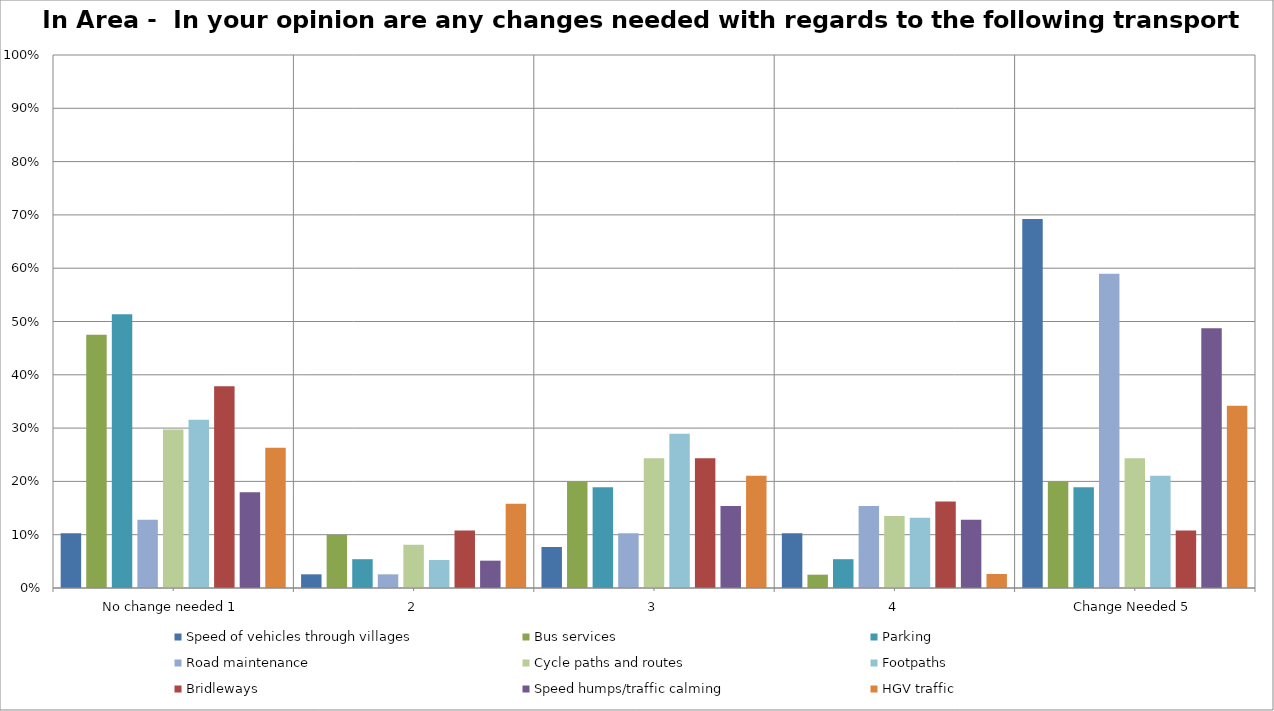
| Category | Speed of vehicles through villages | Bus services | Parking | Road maintenance | Cycle paths and routes | Footpaths | Bridleways | Speed humps/traffic calming | HGV traffic |
|---|---|---|---|---|---|---|---|---|---|
| No change needed 1 | 0.103 | 0.475 | 0.514 | 0.128 | 0.297 | 0.316 | 0.378 | 0.179 | 0.263 |
| 2 | 0.026 | 0.1 | 0.054 | 0.026 | 0.081 | 0.053 | 0.108 | 0.051 | 0.158 |
| 3 | 0.077 | 0.2 | 0.189 | 0.103 | 0.243 | 0.289 | 0.243 | 0.154 | 0.211 |
| 4 | 0.103 | 0.025 | 0.054 | 0.154 | 0.135 | 0.132 | 0.162 | 0.128 | 0.026 |
| Change Needed 5 | 0.692 | 0.2 | 0.189 | 0.59 | 0.243 | 0.211 | 0.108 | 0.487 | 0.342 |